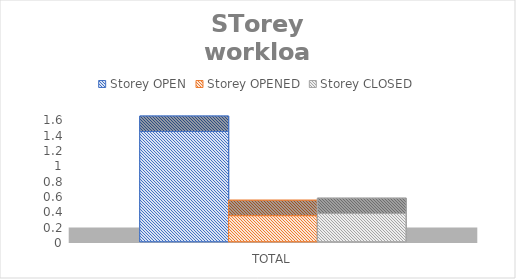
| Category | Storey |
|---|---|
| TOTAL | 0.368 |